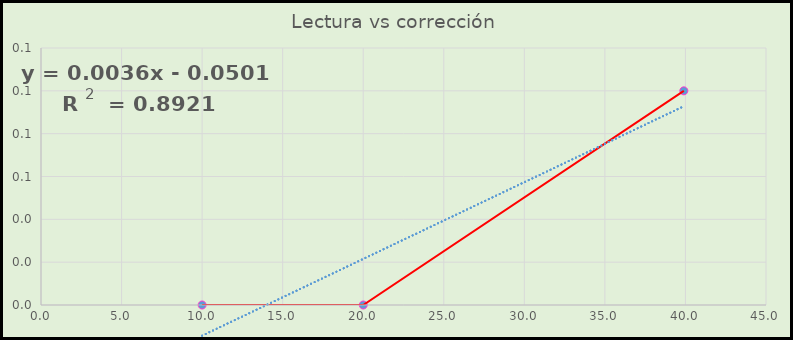
| Category | Corrección °C |
|---|---|
| 10.0 | 0 |
| 20.0 | 0 |
| 39.9 | 0.1 |